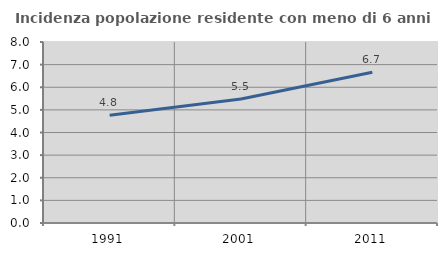
| Category | Incidenza popolazione residente con meno di 6 anni |
|---|---|
| 1991.0 | 4.762 |
| 2001.0 | 5.479 |
| 2011.0 | 6.667 |